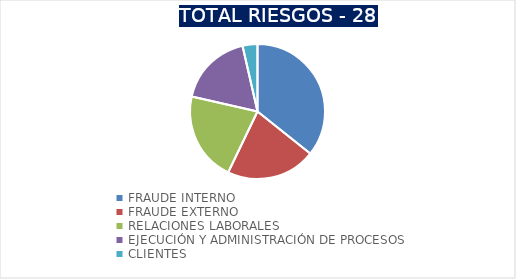
| Category | Series 0 |
|---|---|
| FRAUDE INTERNO | 10 |
| FRAUDE EXTERNO | 6 |
| RELACIONES LABORALES | 6 |
| EJECUCIÓN Y ADMINISTRACIÓN DE PROCESOS | 5 |
| CLIENTES | 1 |